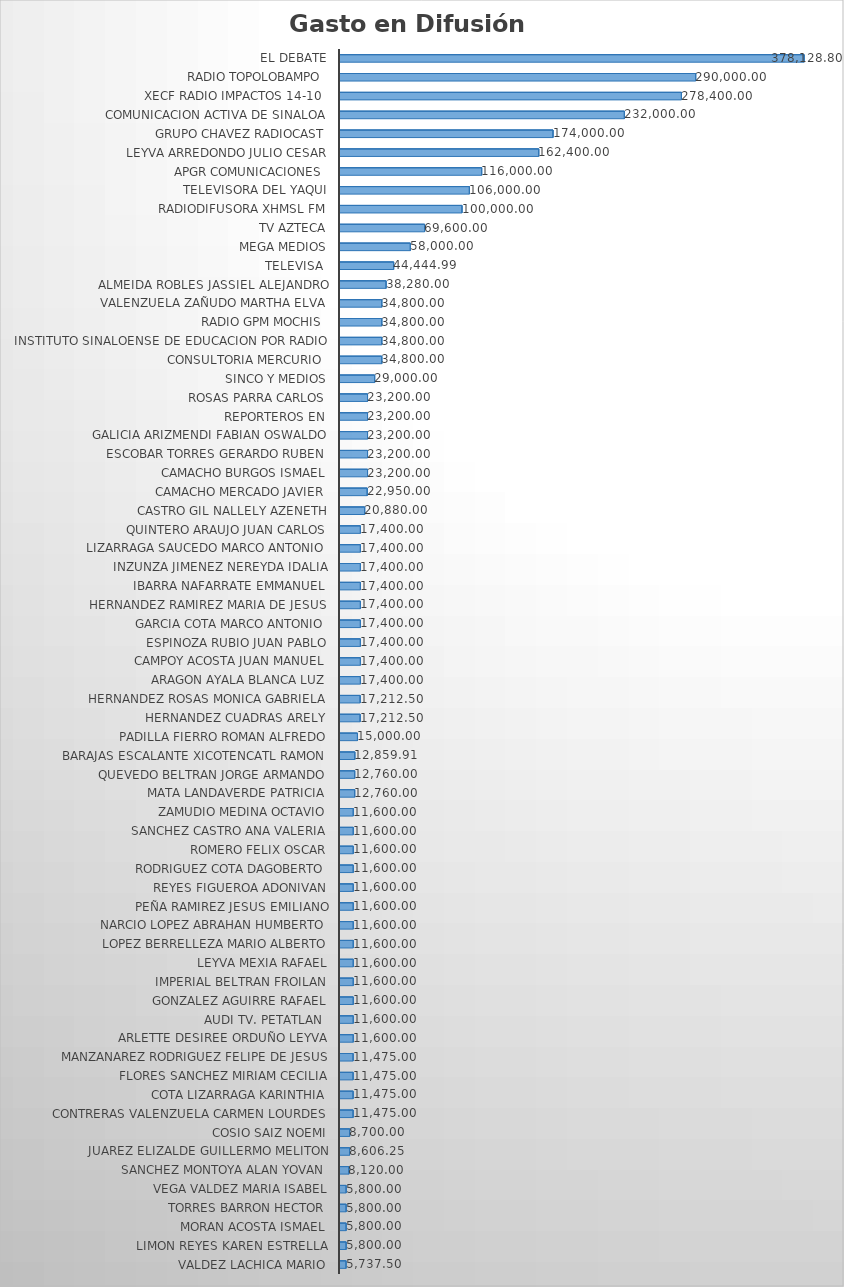
| Category | Suma  |
|---|---|
| VALDEZ LACHICA MARIO | 5737.5 |
| LIMON REYES KAREN ESTRELLA | 5800 |
| MORAN ACOSTA ISMAEL | 5800 |
| TORRES BARRON HECTOR | 5800 |
| VEGA VALDEZ MARIA ISABEL | 5800 |
| SANCHEZ MONTOYA ALAN YOVAN | 8120 |
| JUAREZ ELIZALDE GUILLERMO MELITON | 8606.25 |
| COSIO SAIZ NOEMI | 8700 |
| CONTRERAS VALENZUELA CARMEN LOURDES | 11475 |
| COTA LIZARRAGA KARINTHIA | 11475 |
| FLORES SANCHEZ MIRIAM CECILIA | 11475 |
| MANZANAREZ RODRIGUEZ FELIPE DE JESUS | 11475 |
| ARLETTE DESIREE ORDUÑO LEYVA | 11600 |
| AUDI TV. PETATLAN  | 11600 |
| GONZALEZ AGUIRRE RAFAEL | 11600 |
| IMPERIAL BELTRAN FROILAN | 11600 |
| LEYVA MEXIA RAFAEL | 11600 |
| LOPEZ BERRELLEZA MARIO ALBERTO | 11600 |
| NARCIO LOPEZ ABRAHAN HUMBERTO | 11600 |
| PEÑA RAMIREZ JESUS EMILIANO | 11600 |
| REYES FIGUEROA ADONIVAN | 11600 |
| RODRIGUEZ COTA DAGOBERTO | 11600 |
| ROMERO FELIX OSCAR | 11600 |
| SANCHEZ CASTRO ANA VALERIA | 11600 |
| ZAMUDIO MEDINA OCTAVIO | 11600 |
| MATA LANDAVERDE PATRICIA | 12760 |
| QUEVEDO BELTRAN JORGE ARMANDO | 12760 |
| BARAJAS ESCALANTE XICOTENCATL RAMON | 12859.91 |
| PADILLA FIERRO ROMAN ALFREDO | 15000 |
| HERNANDEZ CUADRAS ARELY | 17212.5 |
| HERNANDEZ ROSAS MONICA GABRIELA | 17212.5 |
| ARAGON AYALA BLANCA LUZ | 17400 |
| CAMPOY ACOSTA JUAN MANUEL | 17400 |
| ESPINOZA RUBIO JUAN PABLO | 17400 |
| GARCIA COTA MARCO ANTONIO | 17400 |
| HERNANDEZ RAMIREZ MARIA DE JESUS | 17400 |
| IBARRA NAFARRATE EMMANUEL | 17400 |
| INZUNZA JIMENEZ NEREYDA IDALIA | 17400 |
| LIZARRAGA SAUCEDO MARCO ANTONIO | 17400 |
| QUINTERO ARAUJO JUAN CARLOS | 17400 |
| CASTRO GIL NALLELY AZENETH | 20880 |
| CAMACHO MERCADO JAVIER | 22950 |
| CAMACHO BURGOS ISMAEL | 23200 |
| ESCOBAR TORRES GERARDO RUBEN | 23200 |
| GALICIA ARIZMENDI FABIAN OSWALDO | 23200 |
| REPORTEROS EN | 23200 |
| ROSAS PARRA CARLOS | 23200 |
| SINCO Y MEDIOS | 29000 |
| CONSULTORIA MERCURIO  | 34800 |
| INSTITUTO SINALOENSE DE EDUCACION POR RADIO | 34800 |
| RADIO GPM MOCHIS  | 34800 |
| VALENZUELA ZAÑUDO MARTHA ELVA | 34800 |
| ALMEIDA ROBLES JASSIEL ALEJANDRO | 38280 |
| TELEVISA  | 44444.99 |
| MEGA MEDIOS | 58000 |
| TV AZTECA | 69600 |
| RADIODIFUSORA XHMSL FM | 100000 |
| TELEVISORA DEL YAQUI | 106000 |
| APGR COMUNICACIONES  | 116000 |
| LEYVA ARREDONDO JULIO CESAR | 162400 |
| GRUPO CHAVEZ RADIOCAST | 174000 |
| COMUNICACION ACTIVA DE SINALOA | 232000 |
| XECF RADIO IMPACTOS 14-10  | 278400 |
| RADIO TOPOLOBAMPO  | 290000 |
| EL DEBATE | 378128.8 |